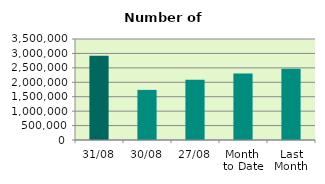
| Category | Series 0 |
|---|---|
| 31/08 | 2915228 |
| 30/08 | 1736230 |
| 27/08 | 2086958 |
| Month 
to Date | 2303894.727 |
| Last
Month | 2465054.636 |